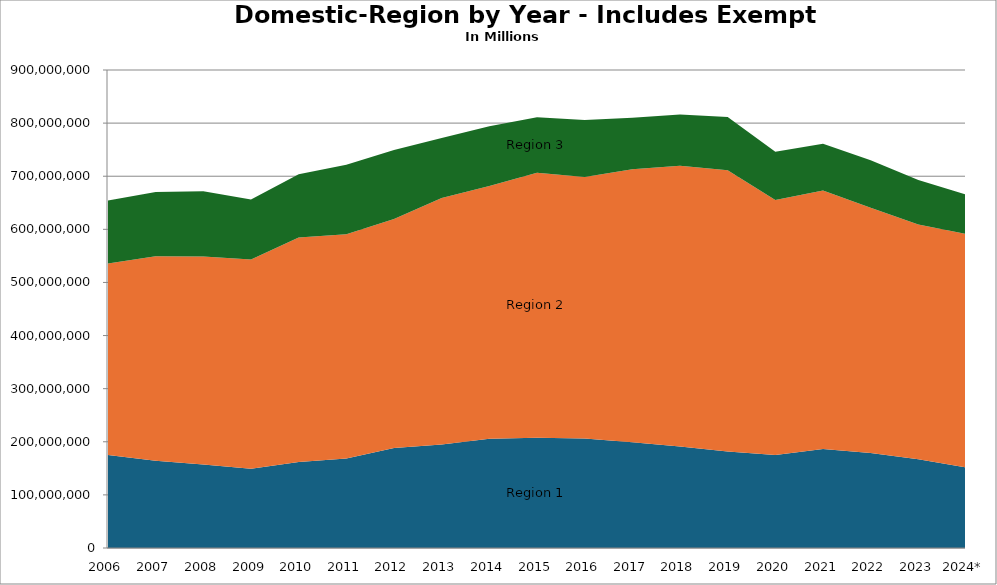
| Category | Series 0 | Series 1 | Series 2 |
|---|---|---|---|
| 2006 | 175339466.183 | 360517338.809 | 118438285.287 |
| 2007 | 164501906 | 384773948.937 | 121045053.81 |
| 2008 | 157180562 | 391534601.5 | 123045406.11 |
| 2009 | 149340756 | 393681149.27 | 113274544.54 |
| 2010 | 162001967.25 | 422618996.51 | 119095606.75 |
| 2011 | 168394228 | 422405800.07 | 130794507.5 |
| 2012 | 188367038 | 430907270 | 130205345 |
| 2013 | 194847876 | 464058604.99 | 113086975 |
| 2014 | 205700295 | 475958212.91 | 112429199 |
| 2015 | 207805228 | 498907361 | 104260583 |
| 2016 | 206113893 | 492286962.818 | 107541574 |
| 2017 | 199226622 | 513804930.727 | 96833914 |
| 2018 | 191297586 | 528233315.45 | 96843381 |
| 2019 | 181473546 | 529633663 | 100253818 |
| 2020 | 175200000 | 480000000 | 91100000 |
| 2021 | 186397000 | 486598000 | 88151000 |
| 2022 | 179087000 | 461643000 | 89327000 |
| 2023 | 167287000 | 441668000 | 83962000 |
| 2024* | 151694700 | 439410900 | 74366700 |